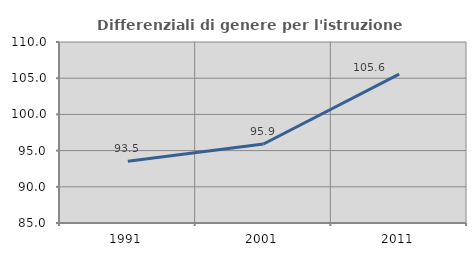
| Category | Differenziali di genere per l'istruzione superiore |
|---|---|
| 1991.0 | 93.532 |
| 2001.0 | 95.912 |
| 2011.0 | 105.561 |